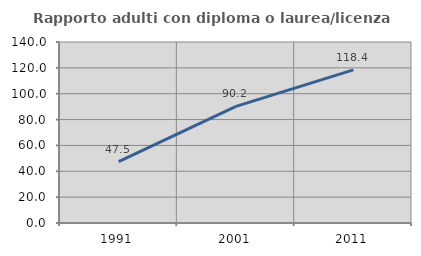
| Category | Rapporto adulti con diploma o laurea/licenza media  |
|---|---|
| 1991.0 | 47.517 |
| 2001.0 | 90.171 |
| 2011.0 | 118.416 |